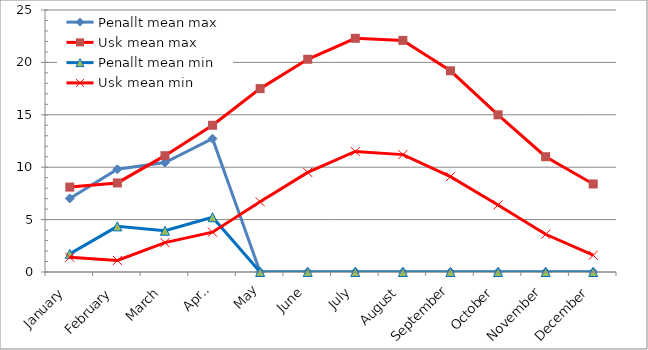
| Category | Penallt mean max | Usk mean max | Penallt mean min | Usk mean min |
|---|---|---|---|---|
| January | 7.019 | 8.1 | 1.732 | 1.4 |
| February | 9.8 | 8.5 | 4.355 | 1.1 |
| March | 10.442 | 11.1 | 3.935 | 2.8 |
| April | 12.723 | 14 | 5.23 | 3.8 |
| May | 0 | 17.5 | 0 | 6.7 |
| June | 0 | 20.3 | 0 | 9.5 |
| July | 0 | 22.3 | 0 | 11.5 |
| August | 0 | 22.1 | 0 | 11.2 |
| September | 0 | 19.2 | 0 | 9.1 |
| October | 0 | 15 | 0 | 6.4 |
| November | 0 | 11 | 0 | 3.6 |
| December | 0 | 8.4 | 0 | 1.6 |